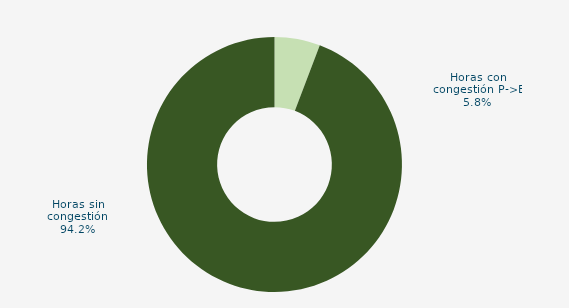
| Category | Horas con congestión E->P |
|---|---|
| Horas con congestión E->P | 0 |
| Horas con congestión P->E | 5.78 |
| Horas sin congestión | 94.22 |